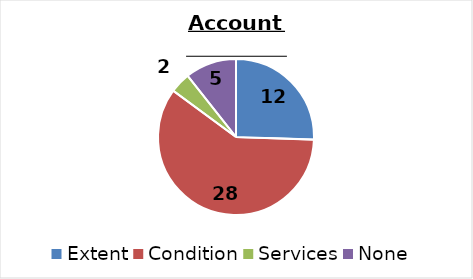
| Category |  Matches |
|---|---|
| Extent | 12 |
| Condition | 28 |
| Services | 2 |
| None | 5 |